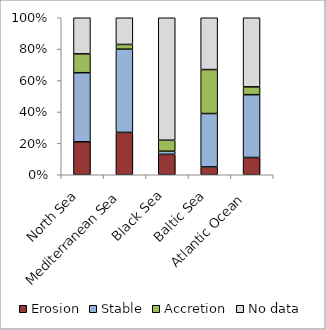
| Category | Erosion | Stable | Accretion | No data |
|---|---|---|---|---|
| North Sea | 21 | 44 | 12 | 23 |
| Mediterranean Sea | 27 | 53 | 3 | 17 |
| Black Sea | 13 | 2 | 7 | 78 |
| Baltic Sea | 5 | 34 | 28 | 33 |
| Atlantic Ocean  | 11 | 40 | 5 | 44 |